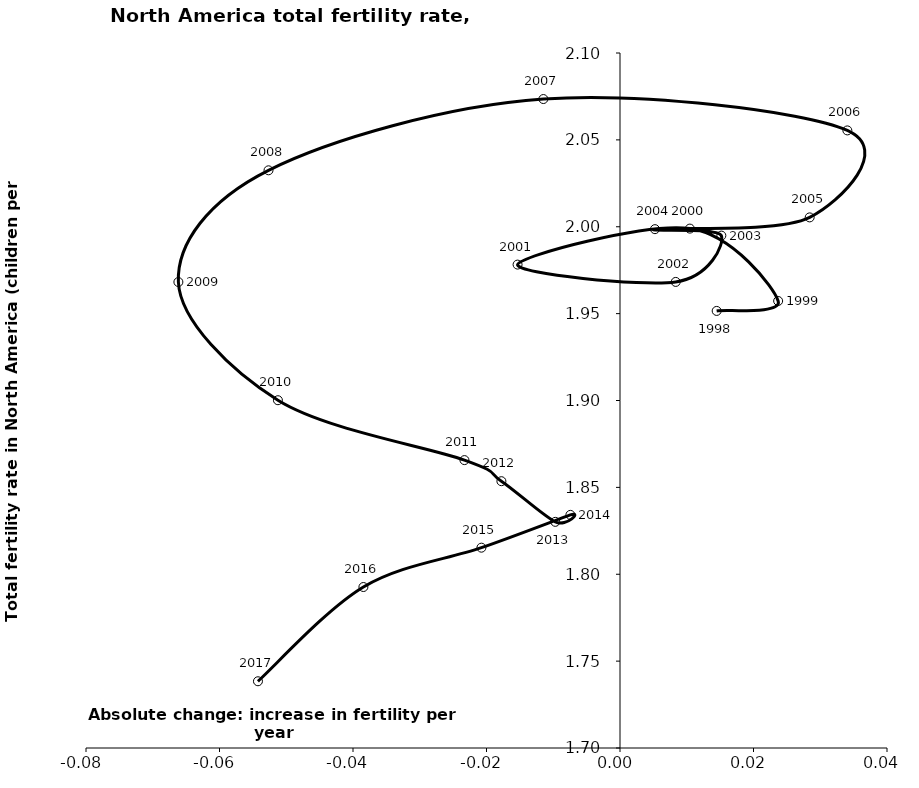
| Category | Series 0 |
|---|---|
| 0.014481533528474144 | 1.952 |
| 0.02369219759239105 | 1.957 |
| 0.010466865820185967 | 1.999 |
| -0.015345334079534423 | 1.978 |
| 0.008348229041416522 | 1.968 |
| 0.015183009063903796 | 1.995 |
| 0.005237164783620463 | 1.999 |
| 0.02841620300680625 | 2.005 |
| 0.03405788246745822 | 2.055 |
| -0.011480150928100397 | 2.074 |
| -0.05265624599105101 | 2.032 |
| -0.06616010696015917 | 1.968 |
| -0.05124796192993342 | 1.9 |
| -0.023303639652361152 | 1.866 |
| -0.017767397403966823 | 1.854 |
| -0.009692315861645429 | 1.83 |
| -0.007432013376074242 | 1.834 |
| -0.020760457726400672 | 1.815 |
| -0.038440338301753196 | 1.793 |
| -0.05423897672687339 | 1.738 |